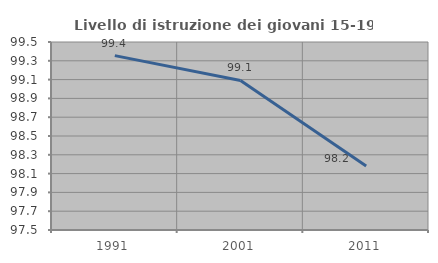
| Category | Livello di istruzione dei giovani 15-19 anni |
|---|---|
| 1991.0 | 99.355 |
| 2001.0 | 99.091 |
| 2011.0 | 98.182 |